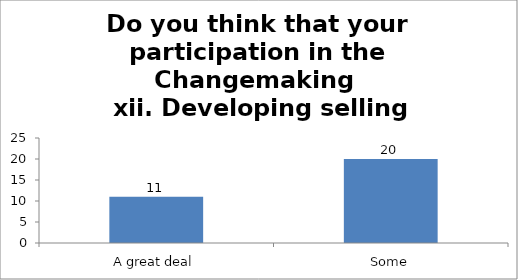
| Category | Do you think that your participation in the Changemaking 
 xii. Developing selling skills. |
|---|---|
| A great deal | 11 |
| Some | 20 |